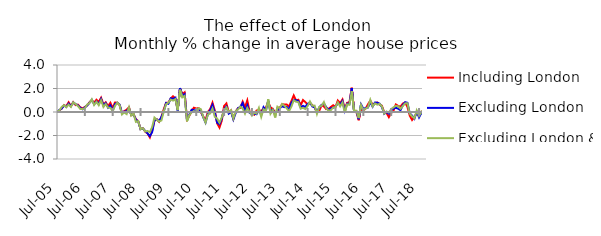
| Category | Including London | Excluding London | Excluding London & SE |
|---|---|---|---|
| 2005-07-01 | 0.004 | -0.027 | 0.069 |
| 2005-08-01 | 0.128 | 0.163 | 0.113 |
| 2005-09-01 | 0.297 | 0.295 | 0.421 |
| 2005-10-01 | 0.584 | 0.545 | 0.585 |
| 2005-11-01 | 0.486 | 0.433 | 0.401 |
| 2005-12-01 | 0.828 | 0.713 | 0.635 |
| 2006-01-01 | 0.509 | 0.504 | 0.432 |
| 2006-02-01 | 0.838 | 0.808 | 0.823 |
| 2006-03-01 | 0.586 | 0.674 | 0.681 |
| 2006-04-01 | 0.628 | 0.563 | 0.509 |
| 2006-05-01 | 0.405 | 0.361 | 0.266 |
| 2006-06-01 | 0.306 | 0.233 | 0.241 |
| 2006-07-01 | 0.429 | 0.392 | 0.321 |
| 2006-08-01 | 0.565 | 0.554 | 0.633 |
| 2006-09-01 | 0.835 | 0.786 | 0.762 |
| 2006-10-01 | 0.993 | 1.028 | 1.077 |
| 2006-11-01 | 0.798 | 0.657 | 0.597 |
| 2006-12-01 | 1.047 | 0.896 | 0.873 |
| 2007-01-01 | 0.861 | 0.675 | 0.579 |
| 2007-02-01 | 1.212 | 1.103 | 1.006 |
| 2007-03-01 | 0.649 | 0.564 | 0.427 |
| 2007-04-01 | 0.826 | 0.759 | 0.678 |
| 2007-05-01 | 0.491 | 0.363 | 0.375 |
| 2007-06-01 | 0.782 | 0.561 | 0.366 |
| 2007-07-01 | 0.32 | 0.1 | 0.07 |
| 2007-08-01 | 0.81 | 0.683 | 0.526 |
| 2007-09-01 | 0.786 | 0.789 | 0.799 |
| 2007-10-01 | 0.574 | 0.623 | 0.585 |
| 2007-11-01 | -0.113 | -0.077 | -0.206 |
| 2007-12-01 | 0.076 | 0.042 | -0.036 |
| 2008-01-01 | 0.196 | 0.057 | -0.181 |
| 2008-02-01 | 0.402 | 0.318 | 0.4 |
| 2008-03-01 | -0.271 | -0.253 | -0.302 |
| 2008-04-01 | -0.188 | -0.2 | -0.142 |
| 2008-05-01 | -0.619 | -0.654 | -0.845 |
| 2008-06-01 | -0.782 | -0.813 | -0.776 |
| 2008-07-01 | -1.451 | -1.459 | -1.469 |
| 2008-08-01 | -1.382 | -1.399 | -1.373 |
| 2008-09-01 | -1.671 | -1.607 | -1.657 |
| 2008-10-01 | -1.826 | -1.814 | -1.615 |
| 2008-11-01 | -2.159 | -2.057 | -1.722 |
| 2008-12-01 | -1.562 | -1.704 | -1.276 |
| 2009-01-01 | -0.738 | -0.696 | -0.476 |
| 2009-02-01 | -0.617 | -0.629 | -0.663 |
| 2009-03-01 | -0.835 | -0.775 | -0.813 |
| 2009-04-01 | -0.421 | -0.427 | -0.719 |
| 2009-05-01 | 0.239 | 0.032 | 0.055 |
| 2009-06-01 | 0.777 | 0.768 | 0.66 |
| 2009-07-01 | 0.802 | 0.701 | 0.8 |
| 2009-08-01 | 1.131 | 1.168 | 1.054 |
| 2009-09-01 | 1.337 | 1.113 | 0.972 |
| 2009-10-01 | 1.165 | 1.217 | 1.097 |
| 2009-11-01 | 0.197 | 0.118 | 0.156 |
| 2009-12-01 | 1.981 | 2.035 | 1.897 |
| 2010-01-01 | 1.519 | 1.363 | 1.249 |
| 2010-02-01 | 1.677 | 1.52 | 1.375 |
| 2010-03-01 | -0.627 | -0.692 | -0.795 |
| 2010-04-01 | -0.325 | -0.232 | -0.266 |
| 2010-05-01 | 0.094 | 0.19 | -0.033 |
| 2010-06-01 | 0.367 | 0.159 | 0.081 |
| 2010-07-01 | 0.291 | 0.119 | -0.034 |
| 2010-08-01 | 0.34 | 0.264 | 0.318 |
| 2010-09-01 | -0.022 | 0.097 | 0.241 |
| 2010-10-01 | -0.376 | -0.435 | -0.41 |
| 2010-11-01 | -0.713 | -0.899 | -0.896 |
| 2010-12-01 | 0.005 | -0.185 | -0.217 |
| 2011-01-01 | 0.246 | 0.156 | -0.125 |
| 2011-02-01 | 0.789 | 0.605 | 0.302 |
| 2011-03-01 | 0.128 | -0.038 | -0.411 |
| 2011-04-01 | -0.968 | -0.9 | -0.557 |
| 2011-05-01 | -1.323 | -1.037 | -0.907 |
| 2011-06-01 | -0.728 | -0.567 | -0.453 |
| 2011-07-01 | 0.512 | 0.242 | 0.099 |
| 2011-08-01 | 0.726 | 0.47 | 0.393 |
| 2011-09-01 | -0.007 | -0.138 | -0.009 |
| 2011-10-01 | 0.137 | 0.027 | 0.156 |
| 2011-11-01 | -0.567 | -0.635 | -0.55 |
| 2011-12-01 | 0.039 | -0.073 | 0.07 |
| 2012-01-01 | 0.326 | 0.325 | 0.217 |
| 2012-02-01 | 0.35 | 0.447 | 0.451 |
| 2012-03-01 | 0.876 | 0.755 | 0.302 |
| 2012-04-01 | 0.41 | 0.073 | -0.137 |
| 2012-05-01 | 0.988 | 0.555 | 0.346 |
| 2012-06-01 | 0.006 | -0.081 | 0.004 |
| 2012-07-01 | -0.085 | -0.158 | -0.308 |
| 2012-08-01 | -0.229 | -0.157 | -0.058 |
| 2012-09-01 | 0.128 | -0.186 | -0.139 |
| 2012-10-01 | 0.179 | 0.172 | 0.344 |
| 2012-11-01 | 0.065 | -0.249 | -0.418 |
| 2012-12-01 | 0.317 | 0.405 | 0.234 |
| 2013-01-01 | 0.353 | 0.115 | 0.095 |
| 2013-02-01 | 0.856 | 0.948 | 1.094 |
| 2013-03-01 | 0.386 | 0.079 | -0.146 |
| 2013-04-01 | 0.274 | 0.196 | 0.178 |
| 2013-05-01 | -0.099 | -0.23 | -0.468 |
| 2013-06-01 | 0.123 | 0.165 | 0.449 |
| 2013-07-01 | 0.372 | 0.338 | 0.307 |
| 2013-08-01 | 0.658 | 0.477 | 0.683 |
| 2013-09-01 | 0.643 | 0.413 | 0.532 |
| 2013-10-01 | 0.632 | 0.433 | 0.308 |
| 2013-11-01 | 0.471 | 0.192 | 0.067 |
| 2013-12-01 | 0.925 | 0.764 | 0.46 |
| 2014-01-01 | 1.406 | 1.032 | 0.997 |
| 2014-02-01 | 0.988 | 1.004 | 0.876 |
| 2014-03-01 | 1.041 | 0.92 | 0.836 |
| 2014-04-01 | 0.572 | 0.382 | 0.28 |
| 2014-05-01 | 1.019 | 0.524 | 0.359 |
| 2014-06-01 | 0.845 | 0.427 | 0.25 |
| 2014-07-01 | 0.633 | 0.685 | 0.514 |
| 2014-08-01 | 0.738 | 0.819 | 0.897 |
| 2014-09-01 | 0.591 | 0.475 | 0.536 |
| 2014-10-01 | 0.374 | 0.403 | 0.543 |
| 2014-11-01 | 0.005 | -0.008 | -0.158 |
| 2014-12-01 | 0.104 | 0.388 | 0.438 |
| 2015-01-01 | 0.566 | 0.596 | 0.531 |
| 2015-02-01 | 0.477 | 0.712 | 0.845 |
| 2015-03-01 | 0.246 | 0.42 | 0.32 |
| 2015-04-01 | 0.268 | 0.15 | 0.11 |
| 2015-05-01 | 0.427 | 0.324 | 0.171 |
| 2015-06-01 | 0.575 | 0.356 | 0.37 |
| 2015-07-01 | 0.419 | 0.456 | 0.42 |
| 2015-08-01 | 0.978 | 0.742 | 0.82 |
| 2015-09-01 | 0.752 | 0.658 | 0.479 |
| 2015-10-01 | 1.06 | 0.93 | 0.809 |
| 2015-11-01 | 0.234 | 0.111 | -0.034 |
| 2015-12-01 | 0.779 | 0.71 | 0.654 |
| 2016-01-01 | 0.813 | 0.679 | 0.611 |
| 2016-02-01 | 2.068 | 2.04 | 1.776 |
| 2016-03-01 | 0.187 | 0.064 | 0.072 |
| 2016-04-01 | -0.005 | 0.068 | 0.11 |
| 2016-05-01 | -0.701 | -0.612 | -0.52 |
| 2016-06-01 | 0.306 | 0.646 | 0.59 |
| 2016-07-01 | 0.133 | 0.264 | 0.142 |
| 2016-08-01 | 0.302 | 0.34 | 0.298 |
| 2016-09-01 | 0.654 | 0.381 | 0.399 |
| 2016-10-01 | 0.961 | 0.856 | 1.037 |
| 2016-11-01 | 0.631 | 0.45 | 0.474 |
| 2016-12-01 | 0.741 | 0.805 | 0.726 |
| 2017-01-01 | 0.814 | 0.789 | 0.628 |
| 2017-02-01 | 0.634 | 0.712 | 0.69 |
| 2017-03-01 | 0.539 | 0.428 | 0.482 |
| 2017-04-01 | -0.041 | -0.152 | -0.135 |
| 2017-05-01 | -0.076 | -0.001 | 0.042 |
| 2017-06-01 | -0.437 | -0.147 | -0.046 |
| 2017-07-01 | -0.09 | 0.173 | 0.244 |
| 2017-08-01 | 0.105 | 0.289 | 0.391 |
| 2017-09-01 | 0.642 | 0.359 | 0.525 |
| 2017-10-01 | 0.513 | 0.284 | 0.486 |
| 2017-11-01 | 0.459 | 0.151 | 0.281 |
| 2017-12-01 | 0.713 | 0.59 | 0.504 |
| 2018-01-01 | 0.802 | 0.832 | 0.733 |
| 2018-02-01 | 0.439 | 0.784 | 0.744 |
| 2018-03-01 | -0.312 | -0.118 | -0.148 |
| 2018-04-01 | -0.68 | -0.303 | -0.369 |
| 2018-05-01 | -0.426 | -0.569 | -0.539 |
| 2018-06-01 | -0.108 | 0.021 | 0.129 |
| 2018-07-01 | -0.205 | -0.461 | -0.33 |
| 2018-08-01 | 0.029 | -0.057 | 0.023 |
| 2018-09-01 | -0.1 | -0.235 | -0.183 |
| 2018-10-01 | 0.413 | 0.222 | 0.288 |